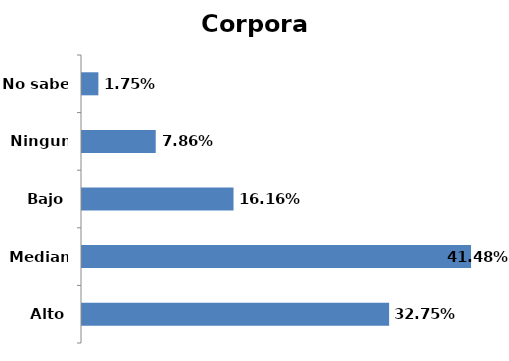
| Category | Series 0 |
|---|---|
| Alto | 0.328 |
| Mediano | 0.415 |
| Bajo | 0.162 |
| Ninguno | 0.079 |
| No sabe | 0.017 |